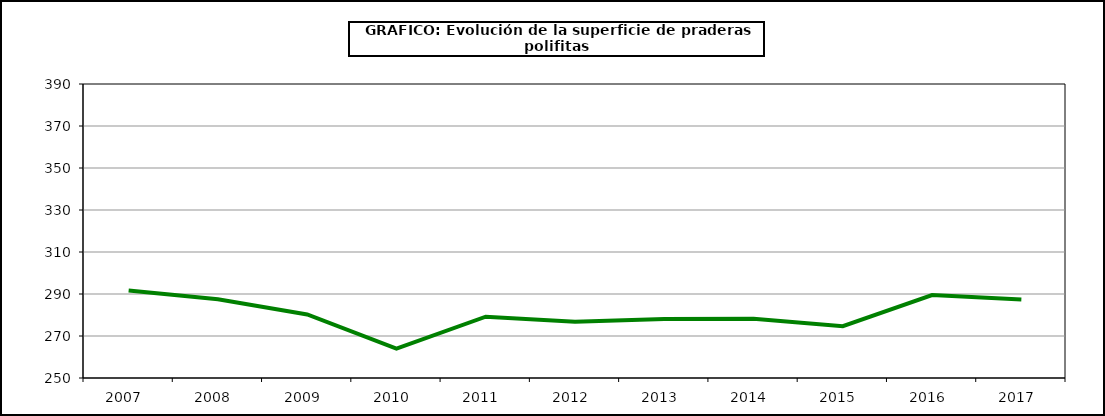
| Category | Superficie |
|---|---|
| 2007.0 | 291.688 |
| 2008.0 | 287.487 |
| 2009.0 | 280.266 |
| 2010.0 | 264.037 |
| 2011.0 | 279.178 |
| 2012.0 | 276.784 |
| 2013.0 | 278.082 |
| 2014.0 | 278.257 |
| 2015.0 | 274.641 |
| 2016.0 | 289.468 |
| 2017.0 | 287.402 |